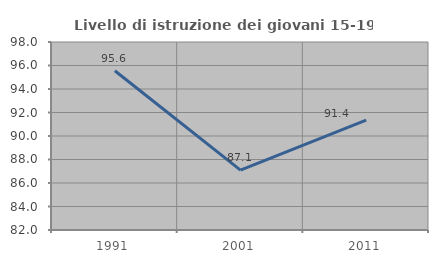
| Category | Livello di istruzione dei giovani 15-19 anni |
|---|---|
| 1991.0 | 95.556 |
| 2001.0 | 87.097 |
| 2011.0 | 91.358 |